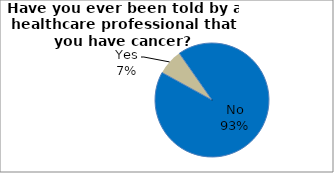
| Category | Series 0 |
|---|---|
| No | 92.721 |
| Yes | 7.279 |